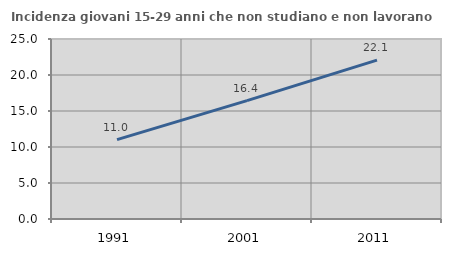
| Category | Incidenza giovani 15-29 anni che non studiano e non lavorano  |
|---|---|
| 1991.0 | 11.029 |
| 2001.0 | 16.438 |
| 2011.0 | 22.059 |